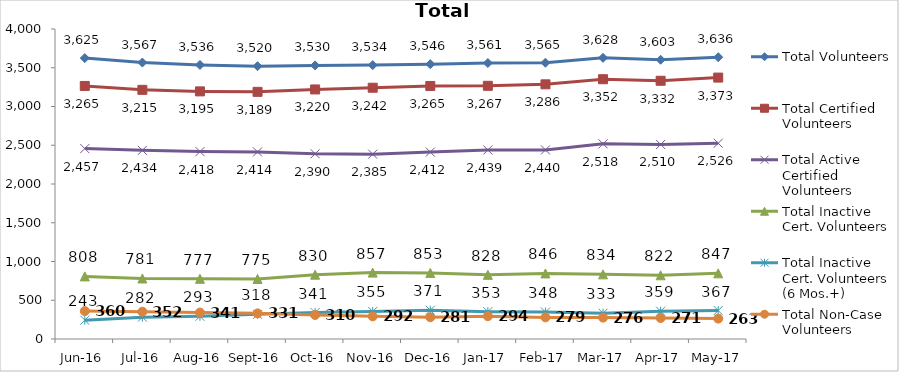
| Category | Total Volunteers | Total Certified Volunteers | Total Active Certified Volunteers | Total Inactive Cert. Volunteers | Total Inactive Cert. Volunteers (6 Mos.+) | Total Non-Case Volunteers |
|---|---|---|---|---|---|---|
| Jun-16 | 3625 | 3265 | 2457 | 808 | 243 | 360 |
| Jul-16 | 3567 | 3215 | 2434 | 781 | 282 | 352 |
| Aug-16 | 3536 | 3195 | 2418 | 777 | 293 | 341 |
| Sep-16 | 3520 | 3189 | 2414 | 775 | 318 | 331 |
| Oct-16 | 3530 | 3220 | 2390 | 830 | 341 | 310 |
| Nov-16 | 3534 | 3242 | 2385 | 857 | 355 | 292 |
| Dec-16 | 3546 | 3265 | 2412 | 853 | 371 | 281 |
| Jan-17 | 3561 | 3267 | 2439 | 828 | 353 | 294 |
| Feb-17 | 3565 | 3286 | 2440 | 846 | 348 | 279 |
| Mar-17 | 3628 | 3352 | 2518 | 834 | 333 | 276 |
| Apr-17 | 3603 | 3332 | 2510 | 822 | 359 | 271 |
| May-17 | 3636 | 3373 | 2526 | 847 | 367 | 263 |